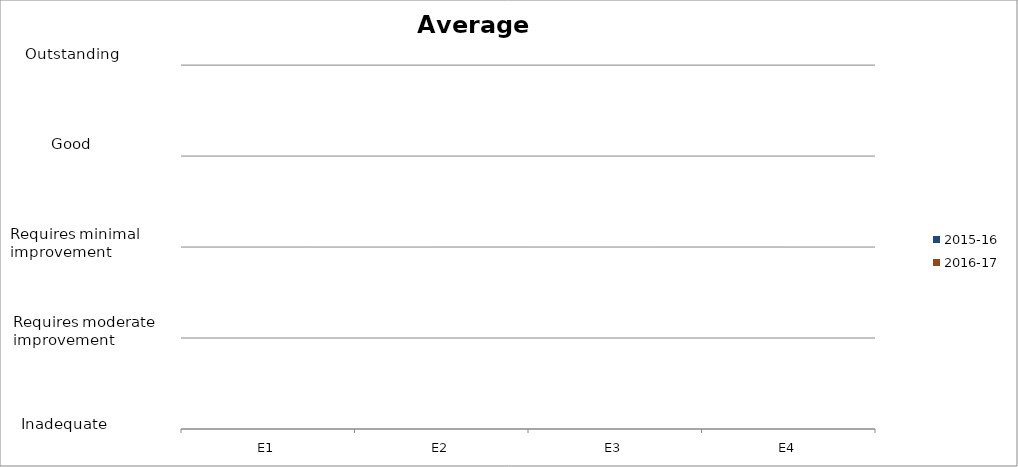
| Category | 2015-16 | 2016-17 |
|---|---|---|
| E1 | 0 | 0 |
| E2 | 0 | 0 |
| E3 | 0 | 0 |
| E4 | 0 | 0 |